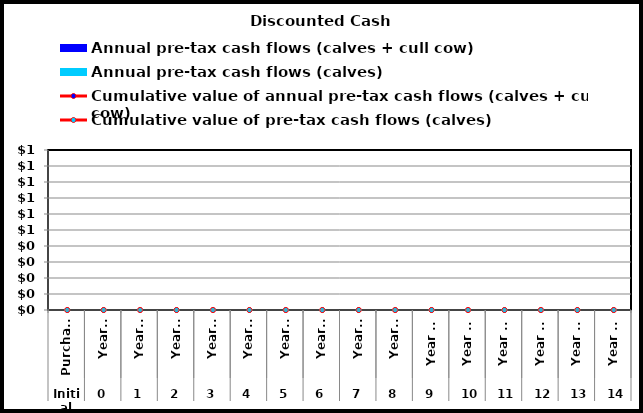
| Category | Annual pre-tax cash flows (calves + cull cow) | Annual pre-tax cash flows (calves) |
|---|---|---|
| 0 | 0 | 0 |
| 1 | 0 | 0 |
| 2 | 0 | 0 |
| 3 | 0 | 0 |
| 4 | 0 | 0 |
| 5 | 0 | 0 |
| 6 | 0 | 0 |
| 7 | 0 | 0 |
| 8 | 0 | 0 |
| 9 | 0 | 0 |
| 10 | 0 | 0 |
| 11 | 0 | 0 |
| 12 | 0 | 0 |
| 13 | 0 | 0 |
| 14 | 0 | 0 |
| 15 | 0 | 0 |